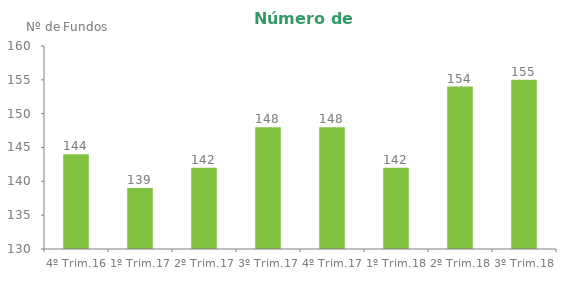
| Category | Series 0 |
|---|---|
| 4º Trim.16 | 144 |
| 1º Trim.17 | 139 |
| 2º Trim.17 | 142 |
| 3º Trim.17 | 148 |
| 4º Trim.17 | 148 |
| 1º Trim.18 | 142 |
| 2º Trim.18 | 154 |
| 3º Trim.18 | 155 |